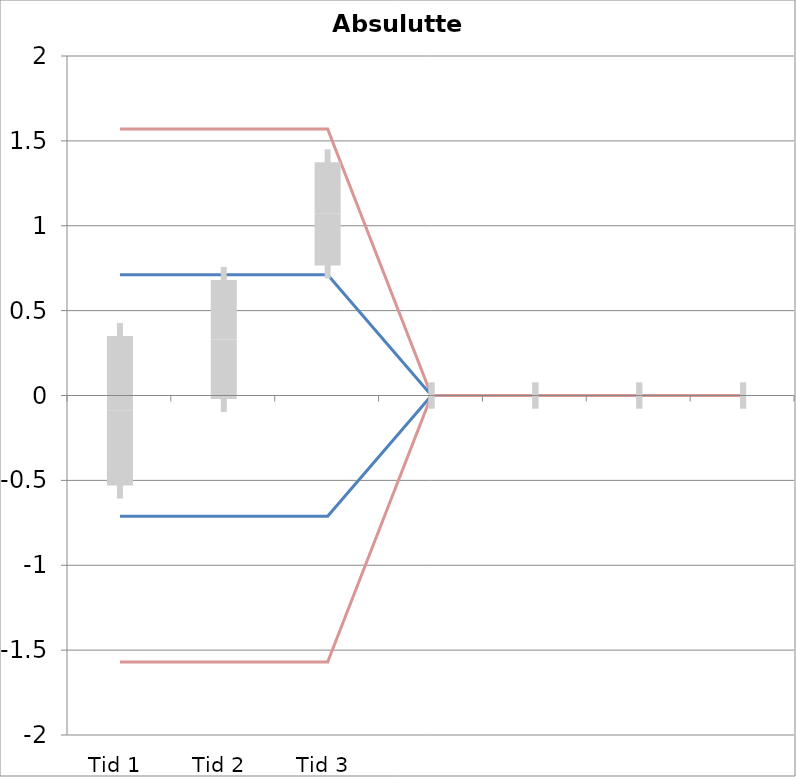
| Category | 1 | 2 | 3 | 4 | 5 | 6 | 7 | 8 | 9 | 10 | 11 | 12 | 13 | 14 | 15 | 16 | 17 | 18 | 19 | 20 | TEa | B | -B | -TEa | M |
|---|---|---|---|---|---|---|---|---|---|---|---|---|---|---|---|---|---|---|---|---|---|---|---|---|---|
| Tid 1 | 0.1 | -1.1 | 0.4 | -0.5 | -1 | 0.4 | 0.5 | 0.6 | 0 | -0.3 | 0 | 0 | 0 | 0 | 0 | 0 | 0 | 0 | 0 | 0 | 1.57 | 0.711 | -0.711 | -1.57 | -0.09 |
| Tid 2 | 0.6 | -0.6 | 0.2 | 0.1 | -0.3 | 0.6 | 0.8 | 0.7 | 0.9 | 0.3 | 0 | 0 | 0 | 0 | 0 | 0 | 0 | 0 | 0 | 0 | 1.57 | 0.711 | -0.711 | -1.57 | 0.33 |
| Tid 3 | 0.9 | 0.4 | 0.6 | 0.8 | 0.8 | 1.6 | 1.6 | 1.3 | 1.4 | 1.3 | 0 | 0 | 0 | 0 | 0 | 0 | 0 | 0 | 0 | 0 | 1.57 | 0.711 | -0.711 | -1.57 | 1.07 |